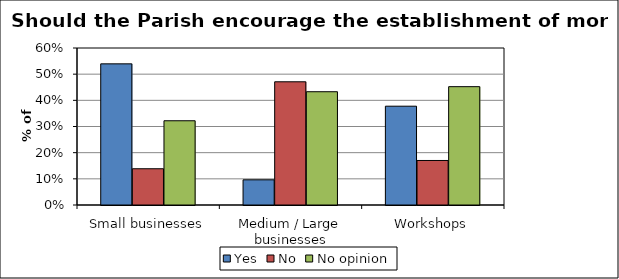
| Category | Yes | No | No opinion |
|---|---|---|---|
| Small businesses | 0.539 | 0.139 | 0.322 |
| Medium / Large businesses | 0.096 | 0.471 | 0.433 |
| Workshops | 0.378 | 0.17 | 0.452 |